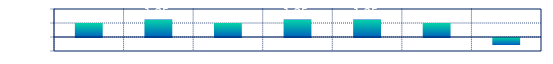
| Category | Series 0 |
|---|---|
| 0 | 1 |
| 1 | 1.25 |
| 2 | 1 |
| 3 | 1.25 |
| 4 | 1.25 |
| 5 | 1 |
| 6 | -0.5 |